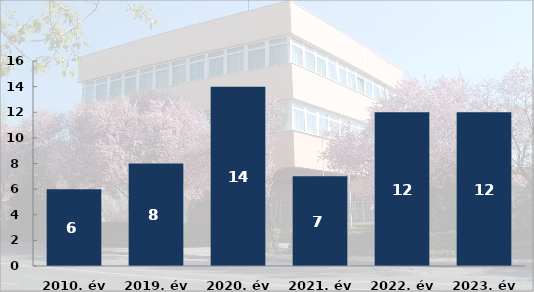
| Category | Személysérüléses közúti közlekedési balesetek száma |
|---|---|
| 2010. év | 6 |
| 2019. év | 8 |
| 2020. év | 14 |
| 2021. év | 7 |
| 2022. év | 12 |
| 2023. év | 12 |